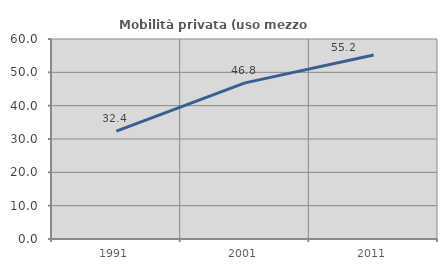
| Category | Mobilità privata (uso mezzo privato) |
|---|---|
| 1991.0 | 32.378 |
| 2001.0 | 46.837 |
| 2011.0 | 55.224 |